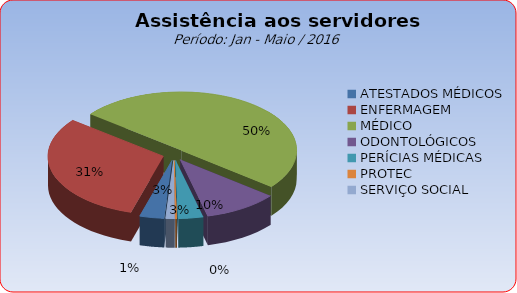
| Category | Series 0 |
|---|---|
| ATESTADOS MÉDICOS | 3.417 |
| ENFERMAGEM | 31.075 |
| MÉDICO | 50.133 |
| ODONTOLÓGICOS | 10.427 |
| PERÍCIAS MÉDICAS | 3.476 |
| PROTEC | 0.236 |
| SERVIÇO SOCIAL | 1.237 |